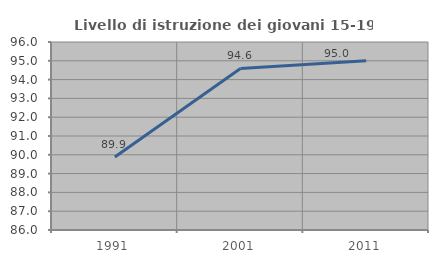
| Category | Livello di istruzione dei giovani 15-19 anni |
|---|---|
| 1991.0 | 89.888 |
| 2001.0 | 94.595 |
| 2011.0 | 95 |